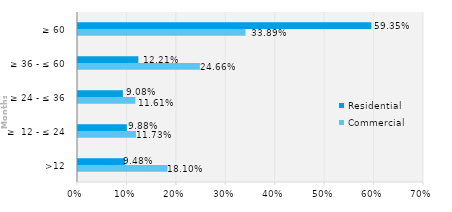
| Category | Commercial | Residential |
|---|---|---|
| >12 | 0.181 | 0.095 |
| ≥  12 - ≤ 24 | 0.117 | 0.099 |
| ≥ 24 - ≤ 36 | 0.116 | 0.091 |
| ≥ 36 - ≤ 60 | 0.247 | 0.122 |
| ≥ 60 | 0.339 | 0.594 |